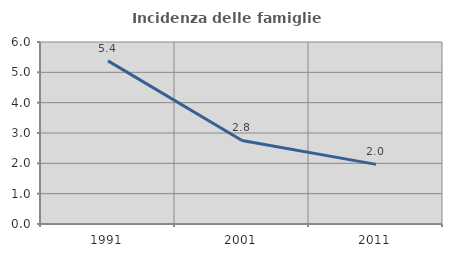
| Category | Incidenza delle famiglie numerose |
|---|---|
| 1991.0 | 5.378 |
| 2001.0 | 2.753 |
| 2011.0 | 1.965 |